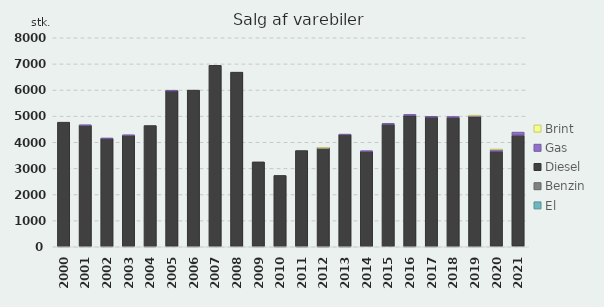
| Category | El | Benzin | Diesel | Gas | Brint |
|---|---|---|---|---|---|
| 2000 | 0 | 3 | 4767 | 0 | 0 |
| 2001 | 0 | 8 | 4644 | 1 | 0 |
| 2002 | 0 | 4 | 4143 | 1 | 0 |
| 2003 | 0 | 7 | 4262 | 2 | 0 |
| 2004 | 0 | 2 | 4638 | 0 | 0 |
| 2005 | 0 | 14 | 5960 | 2 | 0 |
| 2006 | 0 | 4 | 5993 | 0 | 0 |
| 2007 | 0 | 10 | 6935 | 0 | 0 |
| 2008 | 0 | 11 | 6674 | 0 | 0 |
| 2009 | 5 | 10 | 3235 | 0 | 0 |
| 2010 | 4 | 2 | 2725 | 0 | 0 |
| 2011 | 1 | 6 | 3676 | 0 | 0 |
| 2012 | 1 | 2 | 3782 | 1 | 1 |
| 2013 | 4 | 1 | 4289 | 6 | 0 |
| 2014 | 0 | 0 | 3655 | 16 | 0 |
| 2015 | 0 | 0 | 4692 | 31 | 0 |
| 2016 | 0 | 2 | 5014 | 51 | 0 |
| 2017 | 1 | 0 | 4967 | 23 | 0 |
| 2018 | 3 | 0 | 4956 | 21 | 0 |
| 2019 | 2 | 0 | 4976 | 42 | 1 |
| 2020 | 15 | 0 | 3645 | 65 | 1 |
| 2021 | 27 | 2 | 4243 | 118 | 0 |